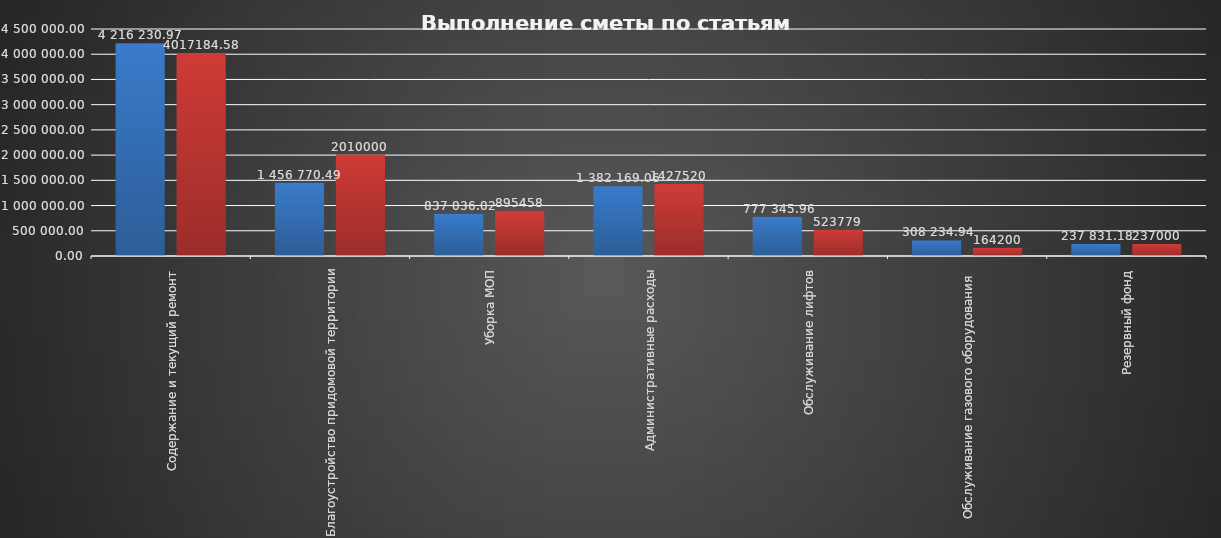
| Category | Начислено | Израсходовано |
|---|---|---|
| Содержание и текущий ремонт | 4216230.97 | 4017184.58 |
| Благоустройство придомовой территории | 1456770.49 | 2010000 |
| Уборка МОП | 837036.02 | 895458 |
| Административные расходы | 1382169.06 | 1427520 |
| Обслуживание лифтов | 777345.96 | 523779 |
| Обслуживание газового оборудования  | 308234.94 | 164200 |
| Резервный фонд | 237831.18 | 237000 |